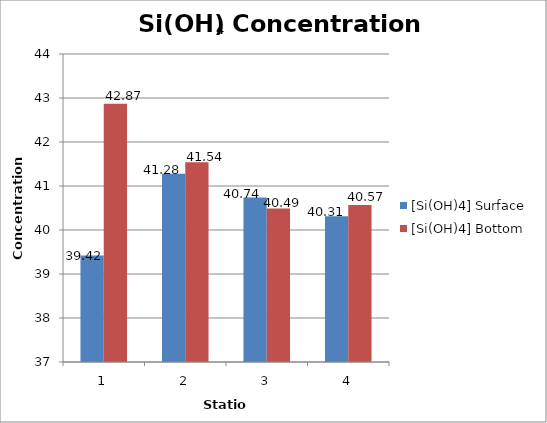
| Category | [Si(OH)4] Surface | [Si(OH)4] Bottom |
|---|---|---|
| 0 | 39.42 | 42.87 |
| 1 | 41.28 | 41.54 |
| 2 | 40.74 | 40.49 |
| 3 | 40.31 | 40.57 |